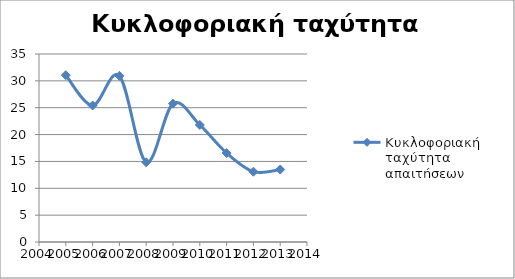
| Category | Κυκλοφοριακή ταχύτητα απαιτήσεων |
|---|---|
| 2005.0 | 31.054 |
| 2006.0 | 25.414 |
| 2007.0 | 30.93 |
| 2008.0 | 14.837 |
| 2009.0 | 25.758 |
| 2010.0 | 21.792 |
| 2011.0 | 16.56 |
| 2012.0 | 13.09 |
| 2013.0 | 13.489 |